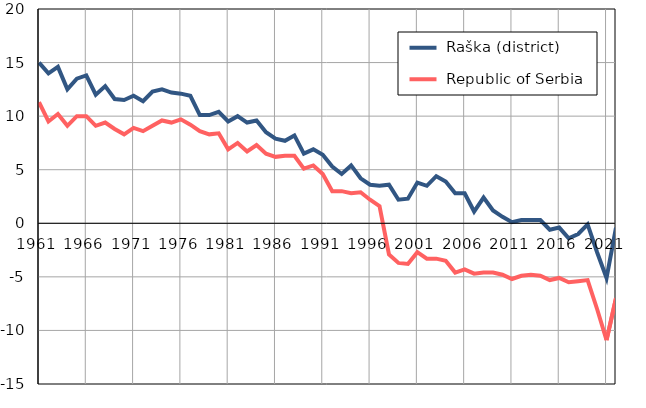
| Category |  Raška (district) |  Republic of Serbia |
|---|---|---|
| 1961.0 | 15 | 11.3 |
| 1962.0 | 14 | 9.5 |
| 1963.0 | 14.6 | 10.2 |
| 1964.0 | 12.5 | 9.1 |
| 1965.0 | 13.5 | 10 |
| 1966.0 | 13.8 | 10 |
| 1967.0 | 12 | 9.1 |
| 1968.0 | 12.8 | 9.4 |
| 1969.0 | 11.6 | 8.8 |
| 1970.0 | 11.5 | 8.3 |
| 1971.0 | 11.9 | 8.9 |
| 1972.0 | 11.4 | 8.6 |
| 1973.0 | 12.3 | 9.1 |
| 1974.0 | 12.5 | 9.6 |
| 1975.0 | 12.2 | 9.4 |
| 1976.0 | 12.1 | 9.7 |
| 1977.0 | 11.9 | 9.2 |
| 1978.0 | 10.1 | 8.6 |
| 1979.0 | 10.1 | 8.3 |
| 1980.0 | 10.4 | 8.4 |
| 1981.0 | 9.5 | 6.9 |
| 1982.0 | 10 | 7.5 |
| 1983.0 | 9.4 | 6.7 |
| 1984.0 | 9.6 | 7.3 |
| 1985.0 | 8.5 | 6.5 |
| 1986.0 | 7.9 | 6.2 |
| 1987.0 | 7.7 | 6.3 |
| 1988.0 | 8.2 | 6.3 |
| 1989.0 | 6.5 | 5.1 |
| 1990.0 | 6.9 | 5.4 |
| 1991.0 | 6.4 | 4.6 |
| 1992.0 | 5.3 | 3 |
| 1993.0 | 4.6 | 3 |
| 1994.0 | 5.4 | 2.8 |
| 1995.0 | 4.2 | 2.9 |
| 1996.0 | 3.6 | 2.2 |
| 1997.0 | 3.5 | 1.6 |
| 1998.0 | 3.6 | -2.9 |
| 1999.0 | 2.2 | -3.7 |
| 2000.0 | 2.3 | -3.8 |
| 2001.0 | 3.8 | -2.7 |
| 2002.0 | 3.5 | -3.3 |
| 2003.0 | 4.4 | -3.3 |
| 2004.0 | 3.9 | -3.5 |
| 2005.0 | 2.8 | -4.6 |
| 2006.0 | 2.8 | -4.3 |
| 2007.0 | 1.1 | -4.7 |
| 2008.0 | 2.4 | -4.6 |
| 2009.0 | 1.2 | -4.6 |
| 2010.0 | 0.6 | -4.8 |
| 2011.0 | 0.1 | -5.2 |
| 2012.0 | 0.3 | -4.9 |
| 2013.0 | 0.3 | -4.8 |
| 2014.0 | 0.3 | -4.9 |
| 2015.0 | -0.6 | -5.3 |
| 2016.0 | -0.4 | -5.1 |
| 2017.0 | -1.4 | -5.5 |
| 2018.0 | -1 | -5.4 |
| 2019.0 | -0.1 | -5.3 |
| 2020.0 | -2.7 | -8 |
| 2021.0 | -5.1 | -10.9 |
| 2022.0 | -0.4 | -7 |